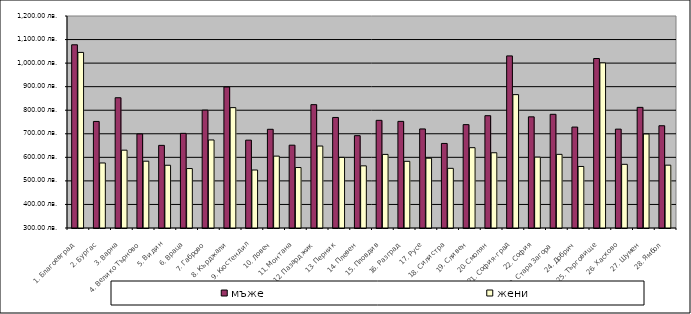
| Category | мъже | жени |
|---|---|---|
| 1. Благоевград | 1077.798 | 1045.419 |
| 2. Бургас | 752.368 | 576.037 |
| 3. Варна | 853 | 630.387 |
| 4. Велико Търново | 699.235 | 583.587 |
| 5. Видин | 650.833 | 566.334 |
| 6. Враца | 701.823 | 552.361 |
| 7. Габрово | 800.432 | 673.716 |
| 8. Кърджали | 898.544 | 811.007 |
| 9. Кюстендил | 672.985 | 546.178 |
| 10. Ловеч | 719.053 | 605.134 |
| 11. Монтана | 651.566 | 556.76 |
| 12. Пазарджик | 823.694 | 647.921 |
| 13. Перник | 769.269 | 599.771 |
| 14. Плевен | 691.992 | 563.867 |
| 15. Пловдив | 757.037 | 612.478 |
| 16. Разград | 752.634 | 583.103 |
| 17. Русе | 720.511 | 596.316 |
| 18. Силистра | 658.961 | 553.263 |
| 19. Сливен | 738.804 | 640.98 |
| 20. Смолян | 776.774 | 619.418 |
| 21. София-град | 1030.61 | 866.174 |
| 22. София | 771.911 | 600.942 |
| 23. Стара Загора | 782.647 | 612.633 |
| 24. Добрич | 728.499 | 561.236 |
| 25. Търговище | 1019.479 | 1001.103 |
| 26. Хасково | 719.691 | 570.363 |
| 27. Шумен | 812.092 | 699.016 |
| 28. Ямбол | 734.142 | 566.748 |